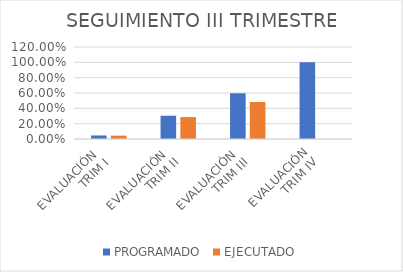
| Category | PROGRAMADO | EJECUTADO |
|---|---|---|
| EVALUACIÓN 
TRIM I | 0.046 | 0.044 |
| EVALUACIÓN 
TRIM II | 0.304 | 0.286 |
| EVALUACIÓN 
TRIM III | 0.596 | 0.483 |
| EVALUACIÓN
 TRIM IV | 1 | 0 |